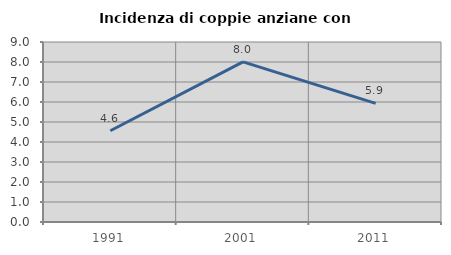
| Category | Incidenza di coppie anziane con figli |
|---|---|
| 1991.0 | 4.561 |
| 2001.0 | 8.007 |
| 2011.0 | 5.928 |